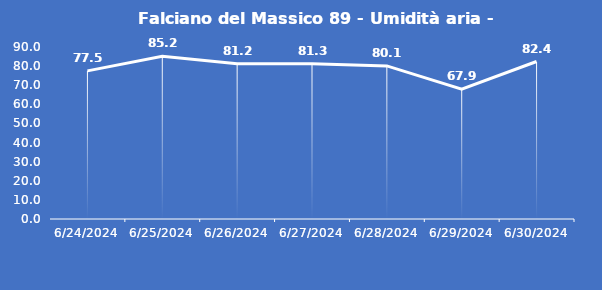
| Category | Falciano del Massico 89 - Umidità aria - Grezzo (%) |
|---|---|
| 6/24/24 | 77.5 |
| 6/25/24 | 85.2 |
| 6/26/24 | 81.2 |
| 6/27/24 | 81.3 |
| 6/28/24 | 80.1 |
| 6/29/24 | 67.9 |
| 6/30/24 | 82.4 |